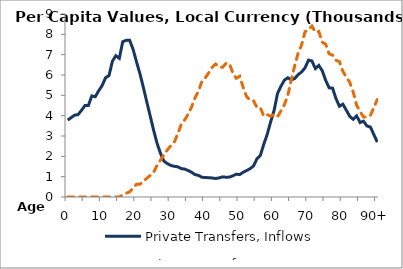
| Category | Private Transfers, Inflows | Private Transfers, Outflows |
|---|---|---|
| 0 | 3781.773 | 0 |
|  | 3903.995 | 0 |
| 2 | 4026.216 | 0 |
| 3 | 4051.515 | 0 |
| 4 | 4261.076 | 0 |
| 5 | 4496.962 | 0 |
| 6 | 4495.82 | 0 |
| 7 | 4969.909 | 0 |
| 8 | 4930.979 | 0 |
| 9 | 5221.573 | 0 |
| 10 | 5480.293 | 0 |
| 11 | 5863.558 | 0 |
| 12 | 5973.309 | 0 |
| 13 | 6681.525 | 0 |
| 14 | 6949.534 | 0 |
| 15 | 6821.268 | 0 |
| 16 | 7639.151 | 110.151 |
| 17 | 7704.407 | 182.586 |
| 18 | 7711.948 | 252.625 |
| 19 | 7263.834 | 441.658 |
| 20 | 6645.523 | 623.351 |
| 21 | 6063.337 | 630.742 |
| 22 | 5380.616 | 764.123 |
| 23 | 4666.834 | 924.691 |
| 24 | 3973.098 | 1062.241 |
| 25 | 3267.913 | 1218.245 |
| 26 | 2625.824 | 1565.516 |
| 27 | 2137.136 | 1822.402 |
| 28 | 1756.839 | 2073.466 |
| 29 | 1638.86 | 2323.953 |
| 30 | 1550.406 | 2530.987 |
| 31 | 1510.424 | 2708.931 |
| 32 | 1485.843 | 3100.799 |
| 33 | 1396.213 | 3571.723 |
| 34 | 1372.31 | 3792.709 |
| 35 | 1303.498 | 4071.024 |
| 36 | 1218.543 | 4422.625 |
| 37 | 1102.878 | 4876.564 |
| 38 | 1063.769 | 5198.99 |
| 39 | 971.834 | 5681.553 |
| 40 | 957.52 | 5858.925 |
| 41 | 949.031 | 6110.462 |
| 42 | 935.231 | 6377.755 |
| 43 | 911.708 | 6540.691 |
| 44 | 936.751 | 6392.698 |
| 45 | 990.433 | 6378.308 |
| 46 | 971.028 | 6563.607 |
| 47 | 979.068 | 6562.102 |
| 48 | 1040.833 | 6106.018 |
| 49 | 1123.587 | 5838.417 |
| 50 | 1103.713 | 5935.344 |
| 51 | 1215.793 | 5394.967 |
| 52 | 1299.352 | 4940.447 |
| 53 | 1392.142 | 4769.69 |
| 54 | 1521.56 | 4745.37 |
| 55 | 1872.968 | 4411.63 |
| 56 | 2042.67 | 4397.95 |
| 57 | 2592.362 | 3978.178 |
| 58 | 3081.353 | 4048.629 |
| 59 | 3695.896 | 3974.199 |
| 60 | 4256.943 | 4049.842 |
| 61 | 5092.656 | 3943.643 |
| 62 | 5449.667 | 4235.317 |
| 63 | 5747.287 | 4543.836 |
| 64 | 5865.053 | 5005.933 |
| 65 | 5760.692 | 5768.957 |
| 66 | 5827.236 | 6464.208 |
| 67 | 6018.942 | 7083.776 |
| 68 | 6151.953 | 7478.376 |
| 69 | 6355.043 | 8130.266 |
| 70 | 6732.298 | 8223.842 |
| 71 | 6689.362 | 8405.977 |
| 72 | 6318.446 | 8107.804 |
| 73 | 6469.695 | 8141.34 |
| 74 | 6207.803 | 7611.972 |
| 75 | 5739.422 | 7515.7 |
| 76 | 5368.742 | 7040.852 |
| 77 | 5352.858 | 6980.107 |
| 78 | 4840.714 | 6725.523 |
| 79 | 4461.677 | 6655.703 |
| 80 | 4563.5 | 6175.591 |
| 81 | 4268.902 | 5890.5 |
| 82 | 3961.103 | 5638.786 |
| 83 | 3824.839 | 5168.744 |
| 84 | 3992.696 | 4510.808 |
| 85 | 3662.321 | 4204.487 |
| 86 | 3729.021 | 3933.159 |
| 87 | 3492.338 | 3939.85 |
| 88 | 3441.044 | 4008.668 |
| 89 | 3070.28 | 4400.875 |
| 90+ | 2699.515 | 4793.082 |